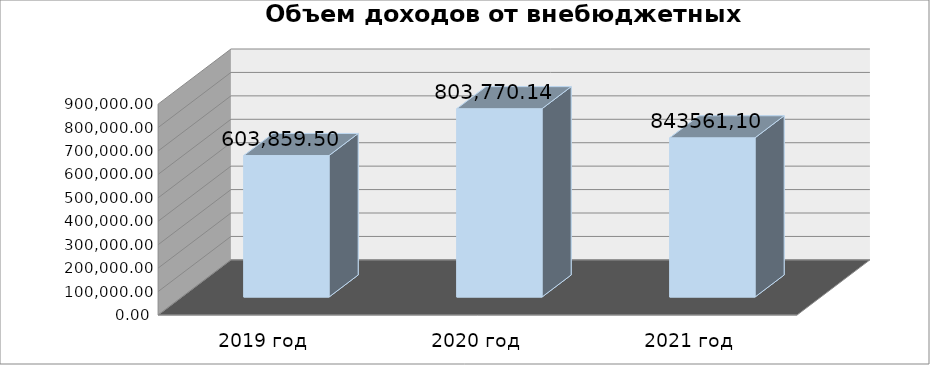
| Category | Series 0 |
|---|---|
| 2019 год | 603859.5 |
| 2020 год | 803770.14 |
| 2021 год | 679547 |